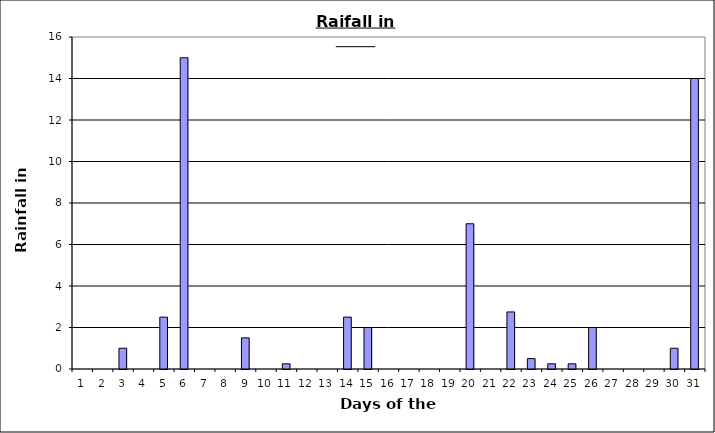
| Category | Series 0 |
|---|---|
| 0 | 0 |
| 1 | 0 |
| 2 | 1 |
| 3 | 0 |
| 4 | 2.5 |
| 5 | 15 |
| 6 | 0 |
| 7 | 0 |
| 8 | 1.5 |
| 9 | 0 |
| 10 | 0.25 |
| 11 | 0 |
| 12 | 0 |
| 13 | 2.5 |
| 14 | 2 |
| 15 | 0 |
| 16 | 0 |
| 17 | 0 |
| 18 | 0 |
| 19 | 7 |
| 20 | 0 |
| 21 | 2.75 |
| 22 | 0.5 |
| 23 | 0.25 |
| 24 | 0.25 |
| 25 | 2 |
| 26 | 0 |
| 27 | 0 |
| 28 | 0 |
| 29 | 1 |
| 30 | 14 |